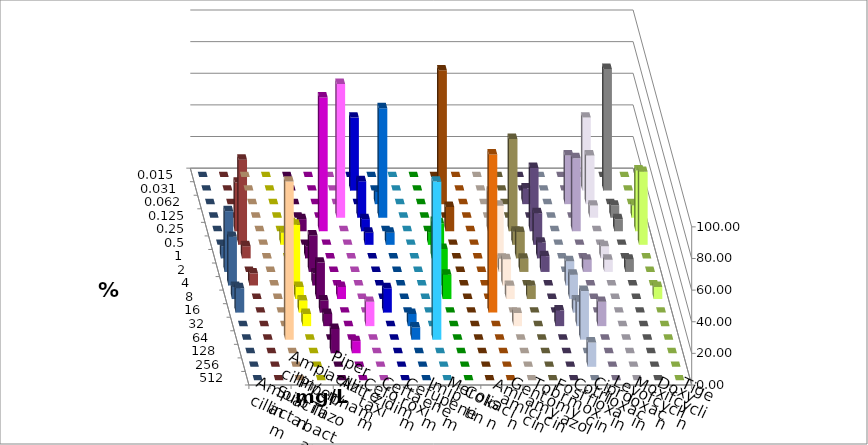
| Category | Ampicillin | Ampicillin/ Sulbactam | Piperacillin | Piperacillin/ Tazobactam | Aztreonam | Cefotaxim | Ceftazidim | Cefuroxim | Imipenem | Meropenem | Colistin | Amikacin | Gentamicin | Tobramycin | Fosfomycin | Cotrimoxazol | Ciprofloxacin | Levofloxacin | Moxifloxacin | Doxycyclin | Tigecyclin |
|---|---|---|---|---|---|---|---|---|---|---|---|---|---|---|---|---|---|---|---|---|---|
| 0.015 | 0 | 0 | 0 | 0 | 0 | 0 | 0 | 0 | 0 | 0 | 0 | 0 | 0 | 0 | 0 | 0 | 0 | 0 | 0 | 0 | 0 |
| 0.031 | 0 | 0 | 0 | 0 | 0 | 46.154 | 0 | 0 | 0 | 0 | 0 | 0 | 0 | 0 | 0 | 0 | 46.154 | 76.923 | 0 | 0 | 0 |
| 0.062 | 0 | 0 | 0 | 0 | 0 | 0 | 7.692 | 0 | 0 | 84.615 | 0 | 0 | 0 | 10 | 0 | 30.769 | 30.769 | 0 | 0 | 0 | 0 |
| 0.125 | 0 | 0 | 0 | 0 | 84.615 | 23.077 | 69.231 | 0 | 0 | 0 | 0 | 0 | 0 | 0 | 0 | 0 | 7.692 | 7.692 | 7.692 | 0 | 0 |
| 0.25 | 0 | 0 | 7.692 | 84.615 | 0 | 7.692 | 0 | 0 | 0 | 15.385 | 0 | 25 | 58.333 | 40 | 0 | 46.154 | 0 | 7.692 | 38.462 | 0 | 30.769 |
| 0.5 | 0 | 7.692 | 0 | 0 | 0 | 7.692 | 7.692 | 0 | 7.692 | 0 | 0 | 0 | 8.333 | 20 | 0 | 0 | 0 | 0 | 46.154 | 0 | 53.846 |
| 1.0 | 0 | 0 | 7.692 | 0 | 0 | 0 | 0 | 0 | 23.077 | 0 | 0 | 33.333 | 16.667 | 10 | 0 | 0 | 7.692 | 0 | 0 | 7.692 | 7.692 |
| 2.0 | 0 | 30.769 | 23.077 | 0 | 0 | 0 | 0 | 0 | 30.769 | 0 | 0 | 8.333 | 8.333 | 10 | 0 | 7.692 | 7.692 | 7.692 | 0 | 38.462 | 0 |
| 4.0 | 0 | 38.462 | 7.692 | 0 | 0 | 0 | 0 | 0 | 23.077 | 0 | 0 | 16.667 | 0 | 0 | 15.385 | 0 | 0 | 0 | 0 | 30.769 | 7.692 |
| 8.0 | 0 | 7.692 | 23.077 | 7.692 | 0 | 0 | 0 | 0 | 15.385 | 0 | 0 | 8.333 | 8.333 | 0 | 15.385 | 0 | 0 | 0 | 7.692 | 7.692 | 0 |
| 16.0 | 0 | 7.692 | 7.692 | 0 | 0 | 15.385 | 0 | 0 | 0 | 0 | 100 | 0 | 0 | 0 | 7.692 | 0 | 0 | 0 | 0 | 15.385 | 0 |
| 32.0 | 0 | 7.692 | 7.692 | 0 | 15.385 | 0 | 7.692 | 0 | 0 | 0 | 0 | 8.333 | 0 | 10 | 15.385 | 15.385 | 0 | 0 | 0 | 0 | 0 |
| 64.0 | 100 | 0 | 0 | 0 | 0 | 0 | 7.692 | 100 | 0 | 0 | 0 | 0 | 0 | 0 | 30.769 | 0 | 0 | 0 | 0 | 0 | 0 |
| 128.0 | 0 | 0 | 15.385 | 7.692 | 0 | 0 | 0 | 0 | 0 | 0 | 0 | 0 | 0 | 0 | 0 | 0 | 0 | 0 | 0 | 0 | 0 |
| 256.0 | 0 | 0 | 0 | 0 | 0 | 0 | 0 | 0 | 0 | 0 | 0 | 0 | 0 | 0 | 15.385 | 0 | 0 | 0 | 0 | 0 | 0 |
| 512.0 | 0 | 0 | 0 | 0 | 0 | 0 | 0 | 0 | 0 | 0 | 0 | 0 | 0 | 0 | 0 | 0 | 0 | 0 | 0 | 0 | 0 |